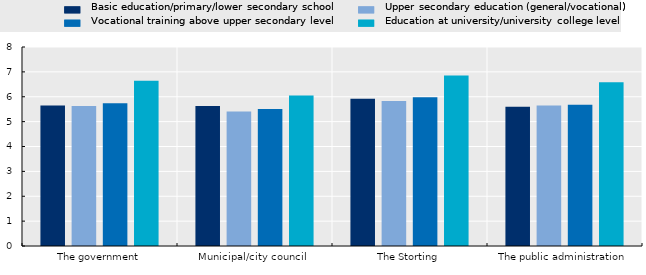
| Category | Basic education/primary/lower secondary school | Upper secondary education (general/vocational) | Vocational training above upper secondary level | Education at university/university college level |
|---|---|---|---|---|
| The government | 5.648 | 5.631 | 5.736 | 6.64 |
| Municipal/city council | 5.628 | 5.406 | 5.503 | 6.046 |
| The Storting | 5.919 | 5.831 | 5.977 | 6.851 |
| The public administration | 5.594 | 5.644 | 5.677 | 6.581 |